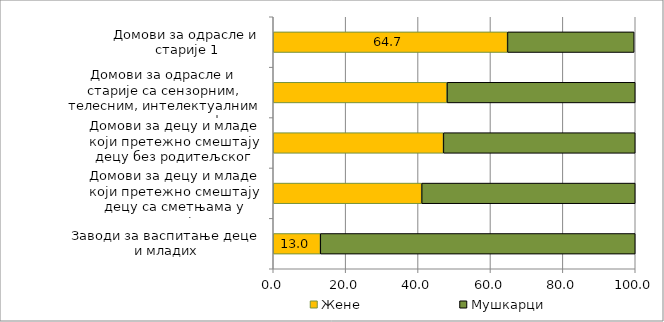
| Category | Жене | Мушкарци |
|---|---|---|
| Заводи за васпитање деце и младих | 13 | 87 |
| Домови за децу и младе који претежно смештају децу са сметњама у развоју | 41 | 59 |
| Домови за децу и младе који претежно смештају децу без родитељског старања | 47 | 53 |
| Домови за одрасле и старије са сензорним, телесним, интелектуалним и менталним тешкоћама | 48 | 52 |
| Домови за одрасле и старије 1 | 64.7 | 35 |